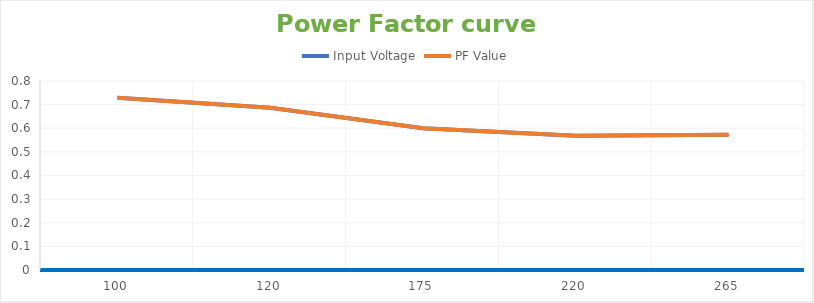
| Category | Input Voltage | PF Value |
|---|---|---|
| 100.0 | 0.729 | 0.729 |
| 120.0 | 0.687 | 0.687 |
| 175.0 | 0.6 | 0.6 |
| 220.0 | 0.568 | 0.568 |
| 265.0 | 0.573 | 0.573 |